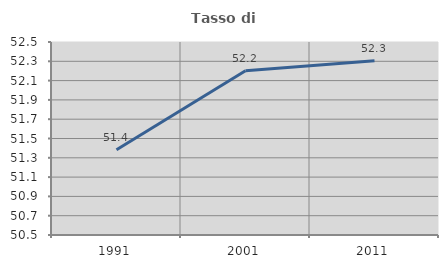
| Category | Tasso di occupazione   |
|---|---|
| 1991.0 | 51.383 |
| 2001.0 | 52.202 |
| 2011.0 | 52.306 |